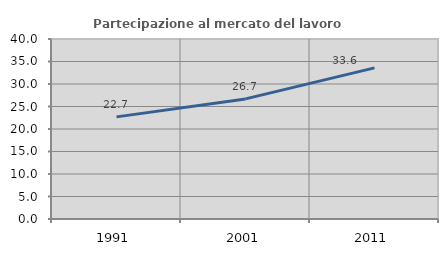
| Category | Partecipazione al mercato del lavoro  femminile |
|---|---|
| 1991.0 | 22.695 |
| 2001.0 | 26.69 |
| 2011.0 | 33.582 |